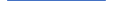
| Category | Series 0 |
|---|---|
| 0 | 36 |
| 1 | 33 |
| 2 | 29 |
| 3 | 32 |
| 4 | 24 |
| 5 | 17 |
| 6 | 47 |
| 7 | 36 |
| 8 | 33 |